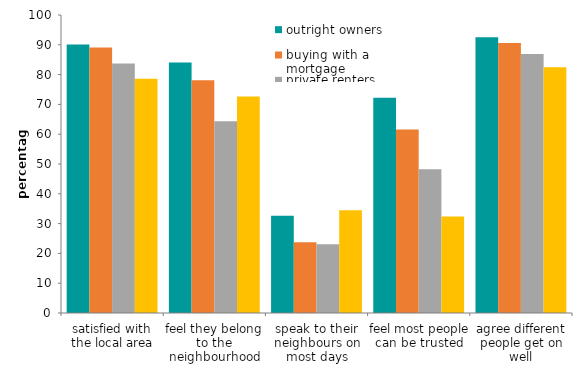
| Category | outright owners | buying with a mortgage | private renters | social renters |
|---|---|---|---|---|
| satisfied with the local area | 90.07 | 89.091 | 83.734 | 78.634 |
| feel they belong to the neighbourhood | 84.062 | 78.104 | 64.318 | 72.653 |
| speak to their neighbours on most days | 32.612 | 23.705 | 23.051 | 34.5 |
| feel most people can be trusted | 72.256 | 61.604 | 48.264 | 32.405 |
| agree different people get on well | 92.526 | 90.592 | 86.887 | 82.474 |